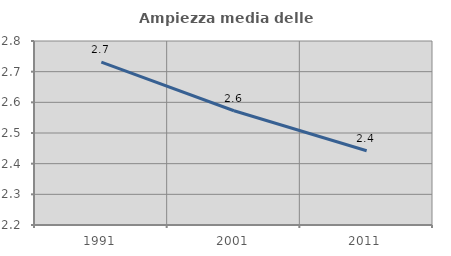
| Category | Ampiezza media delle famiglie |
|---|---|
| 1991.0 | 2.731 |
| 2001.0 | 2.572 |
| 2011.0 | 2.442 |